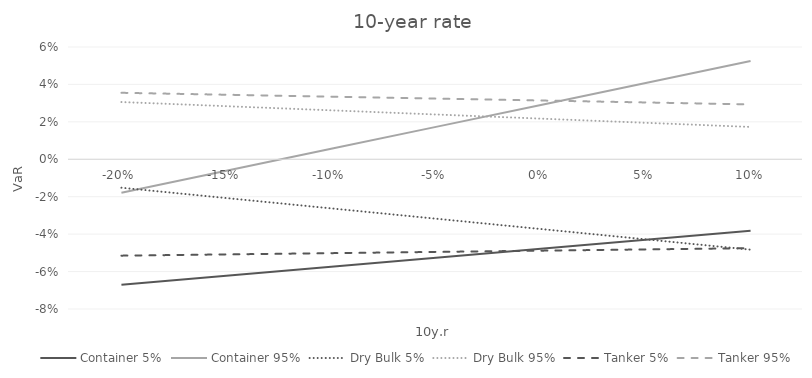
| Category | Container 5% | Container 95% | Dry Bulk 5% | Dry Bulk 95% | Tanker 5% | Tanker 95% |
|---|---|---|---|---|---|---|
| -0.2 | -0.067 | -0.018 | -0.015 | 0.031 | -0.051 | 0.036 |
| -0.15000000000000002 | -0.062 | -0.006 | -0.021 | 0.028 | -0.051 | 0.034 |
| -0.10000000000000002 | -0.057 | 0.006 | -0.026 | 0.026 | -0.05 | 0.033 |
| -0.05000000000000002 | -0.053 | 0.017 | -0.032 | 0.024 | -0.049 | 0.032 |
| 0.0 | -0.048 | 0.029 | -0.037 | 0.022 | -0.049 | 0.031 |
| 0.05 | -0.043 | 0.041 | -0.043 | 0.019 | -0.048 | 0.03 |
| 0.1 | -0.038 | 0.053 | -0.048 | 0.017 | -0.047 | 0.029 |